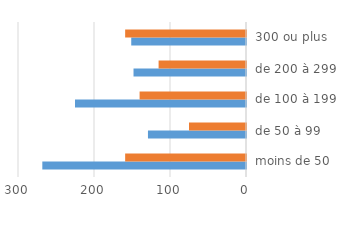
| Category | 2010 | 2020 |
|---|---|---|
| moins de 50 | -268 | -159 |
| de 50 à 99 | -129 | -75 |
| de 100 à 199 | -225 | -140 |
| de 200 à 299 | -148 | -115 |
| 300 ou plus | -151 | -159 |